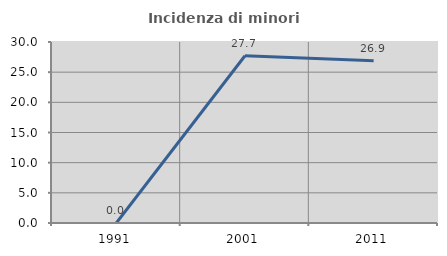
| Category | Incidenza di minori stranieri |
|---|---|
| 1991.0 | 0 |
| 2001.0 | 27.723 |
| 2011.0 | 26.893 |